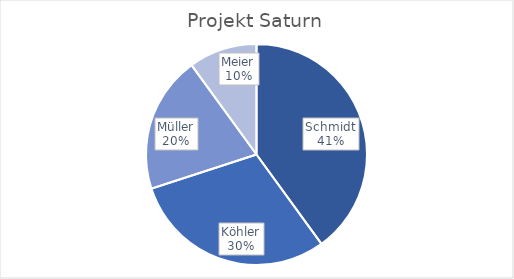
| Category | Projekt Saturn |
|---|---|
| Schmidt | 260000 |
| Köhler | 195000 |
| Müller | 130000 |
| Meier | 65000 |